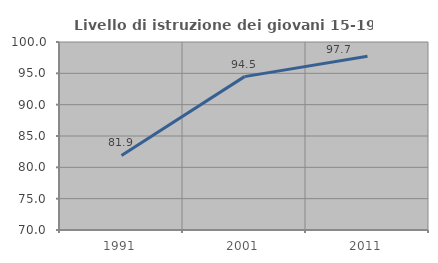
| Category | Livello di istruzione dei giovani 15-19 anni |
|---|---|
| 1991.0 | 81.906 |
| 2001.0 | 94.474 |
| 2011.0 | 97.736 |